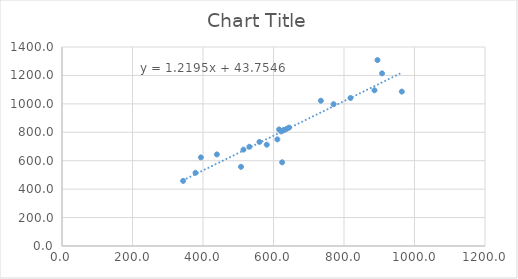
| Category | Series 0 |
|---|---|
| 908.0 | 1214.4 |
| 615.9 | 819.9 |
| 580.9 | 712.7 |
| 964.0 | 1086.3 |
| 770.4 | 997.5 |
| 611.0 | 750.2 |
| 394.0 | 623.3 |
| 439.4 | 644.2 |
| 624.5 | 588.8 |
| 507.8 | 557.1 |
| 734.4 | 1022 |
| 886.5 | 1095.4 |
| 895.0 | 1307.8 |
| 343.6 | 458 |
| 621.9 | 806.159 |
| 378.8 | 515.193 |
| 629.6 | 815.375 |
| 637.1 | 824.352 |
| 514.9 | 678.091 |
| 531.6 | 698.079 |
| 818.5 | 1041.47 |
| 560.2 | 732.31 |
| 644.1 | 832.73 |
| 628.6 | 814.178 |